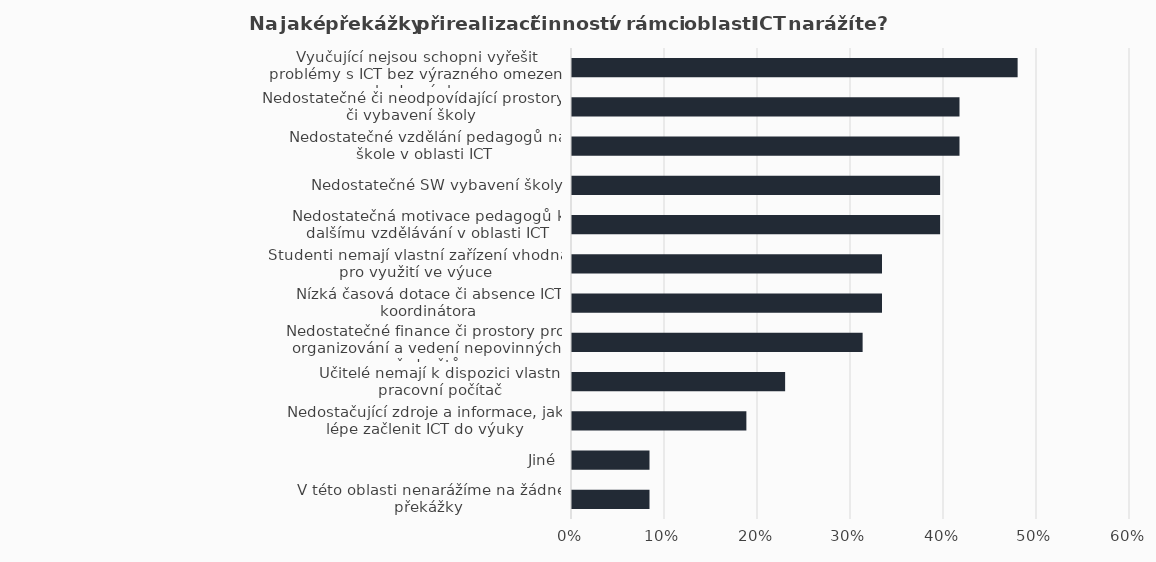
| Category | Series 1 |
|---|---|
| Vyučující nejsou schopni vyřešit problémy s ICT bez výrazného omezení chodu výuky | 0.479 |
| Nedostatečné či neodpovídající prostory či vybavení školy | 0.417 |
| Nedostatečné vzdělání pedagogů na škole v oblasti ICT | 0.417 |
| Nedostatečné SW vybavení školy | 0.396 |
| Nedostatečná motivace pedagogů k dalšímu vzdělávání v oblasti ICT | 0.396 |
| Studenti nemají vlastní zařízení vhodná pro využití ve výuce | 0.333 |
| Nízká časová dotace či absence ICT koordinátora | 0.333 |
| Nedostatečné finance či prostory pro organizování a vedení nepovinných předmětů | 0.312 |
| Učitelé nemají k dispozici vlastní pracovní počítač | 0.229 |
| Nedostačující zdroje a informace, jak lépe začlenit ICT do výuky | 0.188 |
| Jiné | 0.083 |
| V této oblasti nenarážíme na žádné překážky | 0.083 |